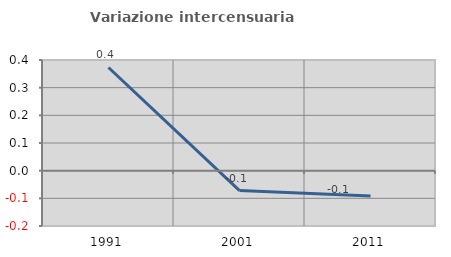
| Category | Variazione intercensuaria annua |
|---|---|
| 1991.0 | 0.373 |
| 2001.0 | -0.072 |
| 2011.0 | -0.092 |